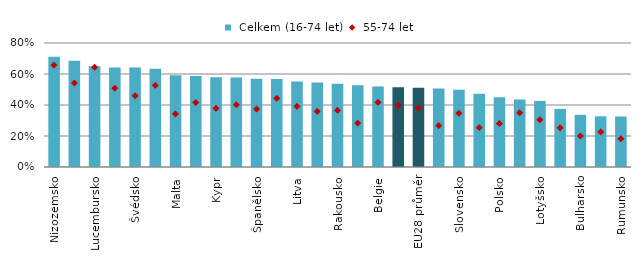
| Category |  Celkem (16-74 let) |
|---|---|
| Nizozemsko | 0.711 |
| Finsko | 0.685 |
| Lucembursko | 0.649 |
| Dánsko | 0.641 |
| Švédsko | 0.641 |
| Německo | 0.634 |
| Malta | 0.592 |
| Estonsko | 0.587 |
| Kypr | 0.58 |
| Maďarsko | 0.577 |
| Španělsko | 0.569 |
| Velká Británie | 0.567 |
| Litva | 0.551 |
| Slovinsko | 0.545 |
| Rakousko | 0.537 |
| Chorvatsko | 0.528 |
| Belgie | 0.52 |
| Česko | 0.514 |
| EU28 průměr | 0.511 |
| Portugalsko | 0.507 |
| Slovensko | 0.499 |
| Řecko | 0.473 |
| Polsko | 0.45 |
| Francie | 0.436 |
| Lotyšsko | 0.426 |
| Irsko | 0.375 |
| Bulharsko | 0.336 |
| Itálie | 0.327 |
| Rumunsko | 0.326 |